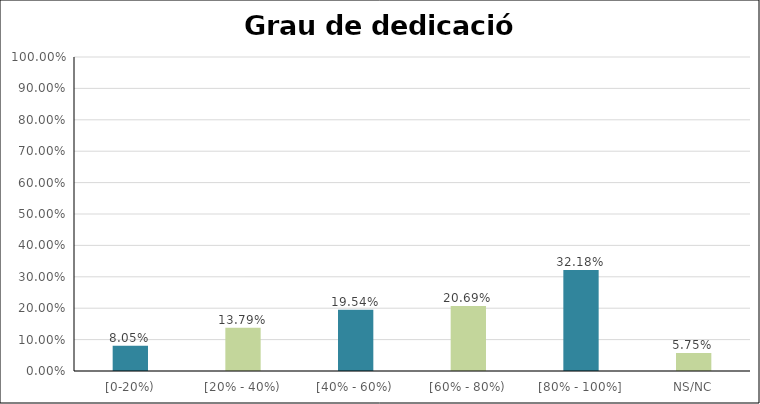
| Category | Series 0 |
|---|---|
| [0-20%) | 0.08 |
| [20% - 40%) | 0.138 |
| [40% - 60%) | 0.195 |
| [60% - 80%) | 0.207 |
| [80% - 100%] | 0.322 |
| NS/NC | 0.057 |